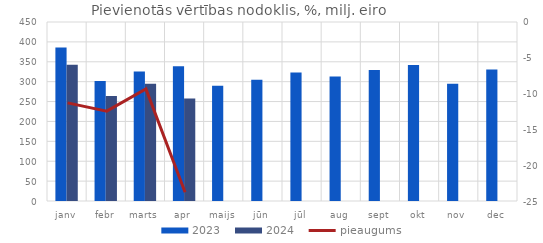
| Category | 2023 | 2024 |
|---|---|---|
| janv | 386.11 | 342.506 |
| febr | 301.806 | 264.233 |
| marts | 325.432 | 295.025 |
| apr | 338.499 | 257.977 |
| maijs | 289.733 | 0 |
| jūn | 305.091 | 0 |
| jūl | 323.284 | 0 |
| aug | 312.936 | 0 |
| sept | 329.266 | 0 |
| okt | 341.811 | 0 |
| nov | 294.749 | 0 |
| dec | 330.799 | 0 |